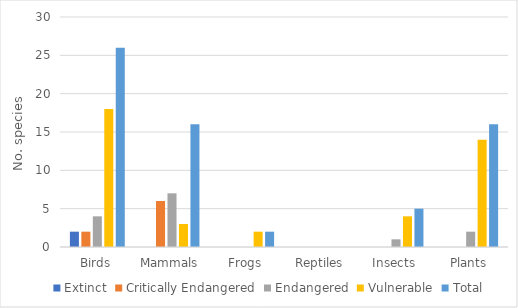
| Category | Extinct | Critically Endangered | Endangered | Vulnerable | Total |
|---|---|---|---|---|---|
| Birds | 2 | 2 | 4 | 18 | 26 |
| Mammals | 0 | 6 | 7 | 3 | 16 |
| Frogs | 0 | 0 | 0 | 2 | 2 |
| Reptiles | 0 | 0 | 0 | 0 | 0 |
| Insects | 0 | 0 | 1 | 4 | 5 |
| Plants | 0 | 0 | 2 | 14 | 16 |